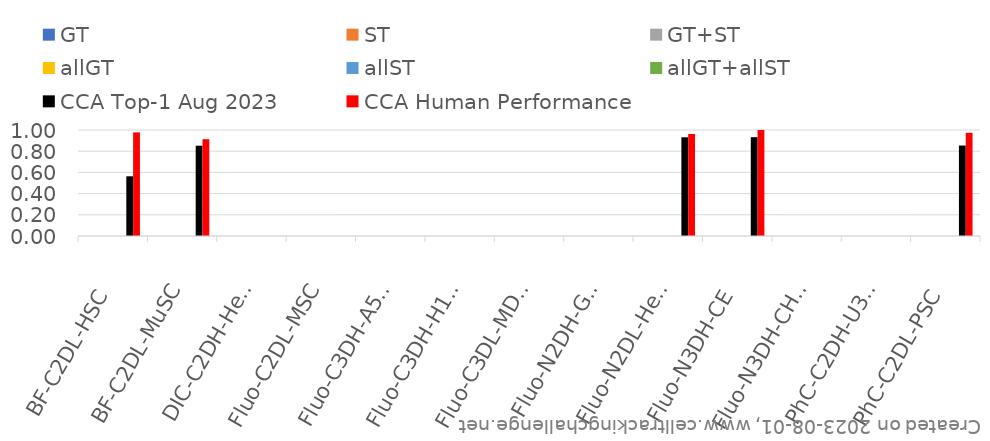
| Category | GT | ST | GT+ST | allGT | allST | allGT+allST | CCA Top-1 Aug 2023 | CCA Human Performance |
|---|---|---|---|---|---|---|---|---|
| BF-C2DL-HSC | 0 | 0 | 0 | 0 | 0 | 0 | 0.563 | 0.977 |
| BF-C2DL-MuSC | 0 | 0 | 0 | 0 | 0 | 0 | 0.852 | 0.913 |
| DIC-C2DH-HeLa | 0 | 0 | 0 | 0 | 0 | 0 | 0 | 0 |
| Fluo-C2DL-MSC | 0 | 0 | 0 | 0 | 0 | 0 | 0 | 0 |
| Fluo-C3DH-A549 | 0 | 0 | 0 | 0 | 0 | 0 | 0 | 0 |
| Fluo-C3DH-H157 | 0 | 0 | 0 | 0 | 0 | 0 | 0 | 0 |
| Fluo-C3DL-MDA231 | 0 | 0 | 0 | 0 | 0 | 0 | 0 | 0 |
| Fluo-N2DH-GOWT1 | 0 | 0 | 0 | 0 | 0 | 0 | 0 | 0 |
| Fluo-N2DL-HeLa | 0 | 0 | 0 | 0 | 0 | 0 | 0.931 | 0.963 |
| Fluo-N3DH-CE | 0 | 0 | 0 | 0 | 0 | 0 | 0.932 | 1 |
| Fluo-N3DH-CHO | 0 | 0 | 0 | 0 | 0 | 0 | 0 | 0 |
| PhC-C2DH-U373 | 0 | 0 | 0 | 0 | 0 | 0 | 0 | 0 |
| PhC-C2DL-PSC | 0 | 0 | 0 | 0 | 0 | 0 | 0.853 | 0.974 |